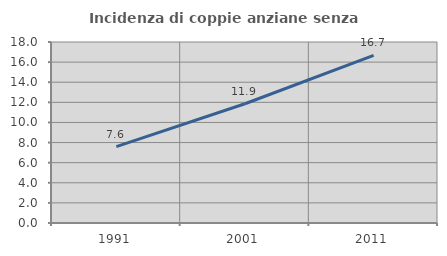
| Category | Incidenza di coppie anziane senza figli  |
|---|---|
| 1991.0 | 7.601 |
| 2001.0 | 11.857 |
| 2011.0 | 16.667 |